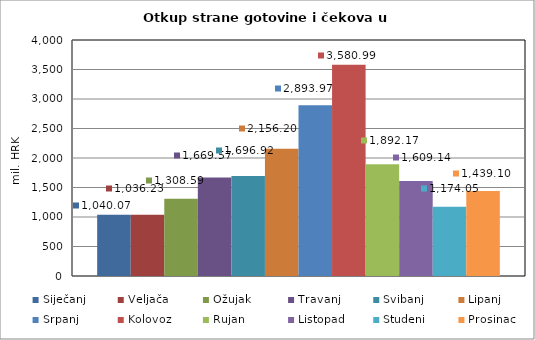
| Category | Siječanj | Veljača | Ožujak | Travanj | Svibanj | Lipanj | Srpanj | Kolovoz | Rujan | Listopad | Studeni | Prosinac |
|---|---|---|---|---|---|---|---|---|---|---|---|---|
| 0 | 1040.071 | 1036.228 | 1308.59 | 1669.574 | 1696.922 | 2156.204 | 2893.973 | 3580.994 | 1892.17 | 1609.142 | 1174.047 | 1439.103 |